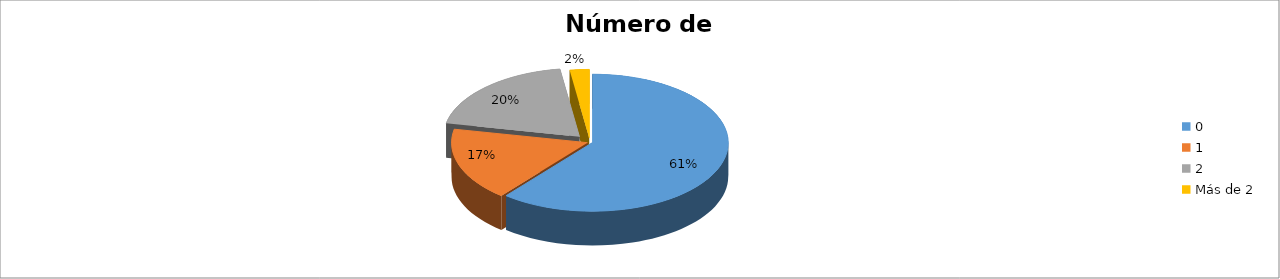
| Category | Series 0 |
|---|---|
| 0 | 0.609 |
| 1 | 0.172 |
| 2 | 0.195 |
| Más de 2 | 0.023 |